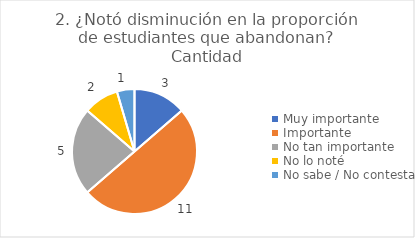
| Category | 2. ¿Notó disminución en la proporción de estudiantes que abandonan? |
|---|---|
| Muy importante  | 0.136 |
| Importante  | 0.5 |
| No tan importante  | 0.227 |
| No lo noté  | 0.091 |
| No sabe / No contesta | 0.045 |